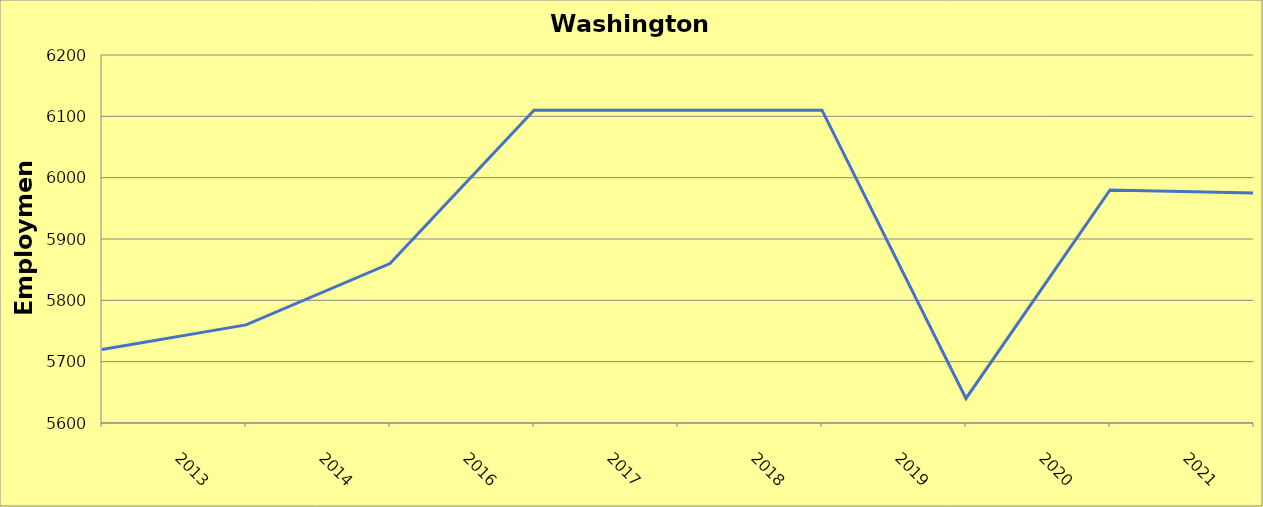
| Category | Washington County |
|---|---|
| 2013.0 | 5720 |
| 2014.0 | 5760 |
| 2016.0 | 5860 |
| 2017.0 | 6110 |
| 2018.0 | 6110 |
| 2019.0 | 6110 |
| 2020.0 | 5640 |
| 2021.0 | 5980 |
| 2022.0 | 5975 |